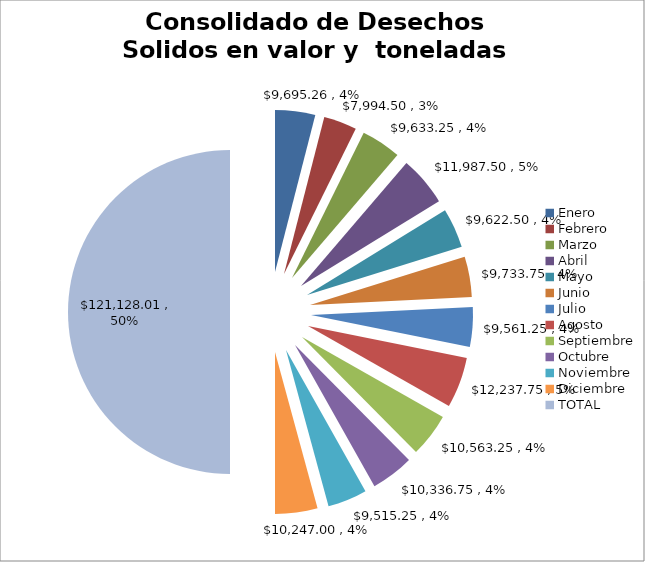
| Category | Consolidado de Desechos Solidos en valor y  toneladas Año 2022 Valor $ | Consolidado de Desechos Solidos en valor y  toneladas Año 2022 Toneladas |
|---|---|---|
| Enero | 9695.26 | 387.81 |
| Febrero | 7994.5 | 319.78 |
| Marzo | 9633.25 | 385.33 |
| Abril | 11987.5 | 479.5 |
| Mayo | 9622.5 | 384.9 |
| Junio | 9733.75 | 389.35 |
| Julio | 9561.25 | 382.45 |
| Agosto | 12237.75 | 489.51 |
| Septiembre | 10563.25 | 422.53 |
| Octubre | 10336.75 | 413.47 |
| Noviembre | 9515.25 | 380.61 |
| Diciembre | 10247 | 409.88 |
| TOTAL  | 121128.01 | 4845.12 |